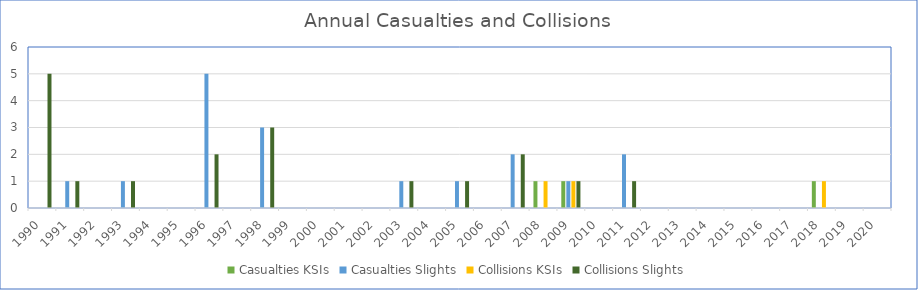
| Category | Casualties | Collisions |
|---|---|---|
| 1990.0 | 0 | 5 |
| 1991.0 | 1 | 1 |
| 1992.0 | 0 | 0 |
| 1993.0 | 1 | 1 |
| 1994.0 | 0 | 0 |
| 1995.0 | 0 | 0 |
| 1996.0 | 5 | 2 |
| 1997.0 | 0 | 0 |
| 1998.0 | 3 | 3 |
| 1999.0 | 0 | 0 |
| 2000.0 | 0 | 0 |
| 2001.0 | 0 | 0 |
| 2002.0 | 0 | 0 |
| 2003.0 | 1 | 1 |
| 2004.0 | 0 | 0 |
| 2005.0 | 1 | 1 |
| 2006.0 | 0 | 0 |
| 2007.0 | 2 | 2 |
| 2008.0 | 0 | 0 |
| 2009.0 | 1 | 1 |
| 2010.0 | 0 | 0 |
| 2011.0 | 2 | 1 |
| 2012.0 | 0 | 0 |
| 2013.0 | 0 | 0 |
| 2014.0 | 0 | 0 |
| 2015.0 | 0 | 0 |
| 2016.0 | 0 | 0 |
| 2017.0 | 0 | 0 |
| 2018.0 | 0 | 0 |
| 2019.0 | 0 | 0 |
| 2020.0 | 0 | 0 |